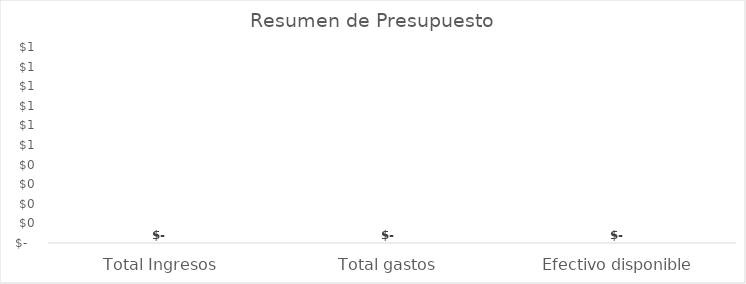
| Category | Series 0 |
|---|---|
| Total Ingresos | 0 |
| Total gastos  | 0 |
| Efectivo disponible | 0 |